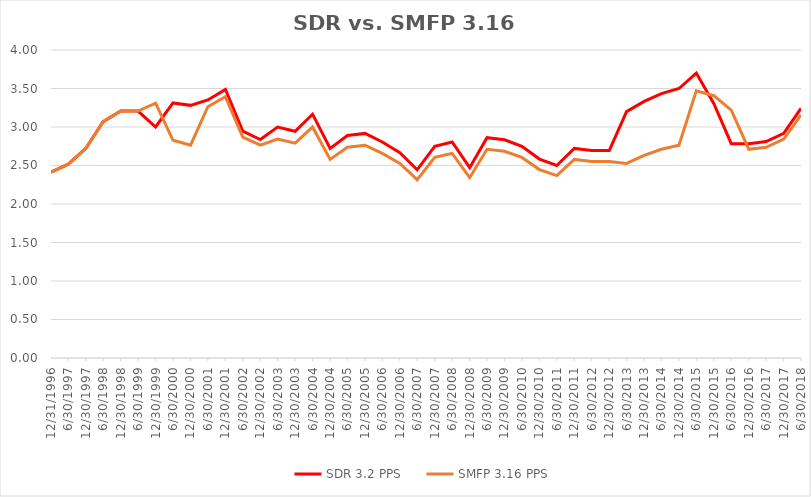
| Category | SDR 3.2 PPS | SMFP 3.16 PPS |
|---|---|---|
| 12/31/96 | 2.414 | 2.414 |
| 6/30/97 | 2.517 | 2.517 |
| 12/31/97 | 2.724 | 2.724 |
| 6/30/98 | 3.069 | 3.069 |
| 12/31/98 | 3.207 | 3.207 |
| 6/30/99 | 3.207 | 3.207 |
| 12/31/99 | 3 | 3.31 |
| 6/30/00 | 3.312 | 2.827 |
| 12/31/00 | 3.281 | 2.763 |
| 6/30/01 | 3.351 | 3.263 |
| 12/31/01 | 3.486 | 3.395 |
| 6/30/02 | 2.946 | 2.868 |
| 12/31/02 | 2.838 | 2.763 |
| 6/30/03 | 3 | 2.842 |
| 12/31/03 | 2.944 | 2.789 |
| 6/30/04 | 3.167 | 3 |
| 12/31/04 | 2.722 | 2.579 |
| 6/30/05 | 2.889 | 2.737 |
| 12/31/05 | 2.917 | 2.763 |
| 6/30/06 | 2.806 | 2.658 |
| 12/31/06 | 2.667 | 2.526 |
| 6/30/07 | 2.444 | 2.316 |
| 12/31/07 | 2.75 | 2.605 |
| 6/30/08 | 2.806 | 2.658 |
| 12/31/08 | 2.472 | 2.342 |
| 6/30/09 | 2.861 | 2.711 |
| 12/31/09 | 2.833 | 2.684 |
| 6/30/10 | 2.75 | 2.605 |
| 12/31/10 | 2.583 | 2.447 |
| 6/30/11 | 2.5 | 2.368 |
| 12/31/11 | 2.722 | 2.579 |
| 6/30/12 | 2.694 | 2.553 |
| 12/31/12 | 2.694 | 2.553 |
| 6/30/13 | 3.2 | 2.526 |
| 12/31/13 | 3.333 | 2.632 |
| 6/30/14 | 3.433 | 2.711 |
| 12/31/14 | 3.5 | 2.763 |
| 6/30/15 | 3.7 | 3.469 |
| 12/31/15 | 3.303 | 3.406 |
| 6/30/16 | 2.784 | 3.219 |
| 12/31/16 | 2.784 | 2.711 |
| 6/30/17 | 2.811 | 2.737 |
| 12/31/17 | 2.919 | 2.842 |
| 6/30/18 | 3.243 | 3.158 |